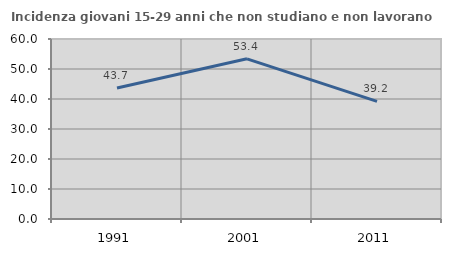
| Category | Incidenza giovani 15-29 anni che non studiano e non lavorano  |
|---|---|
| 1991.0 | 43.684 |
| 2001.0 | 53.399 |
| 2011.0 | 39.214 |